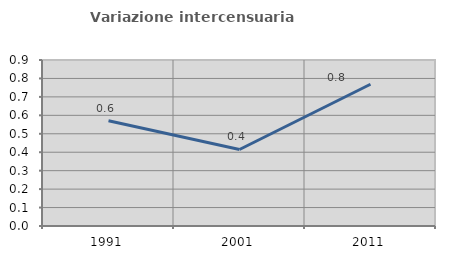
| Category | Variazione intercensuaria annua |
|---|---|
| 1991.0 | 0.57 |
| 2001.0 | 0.415 |
| 2011.0 | 0.769 |